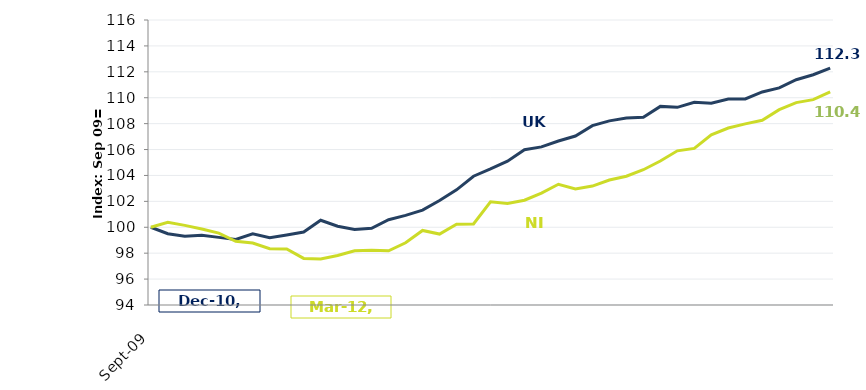
| Category | UK |
|---|---|
| 2009-09-01 | 100 |
| 2009-12-01 | 99.503 |
| 2010-03-01 | 99.303 |
| 2010-06-01 | 99.376 |
| 2010-09-01 | 99.22 |
| 2010-12-01 | 99.064 |
| 2011-03-01 | 99.488 |
| 2011-06-01 | 99.195 |
| 2011-09-01 | 99.401 |
| 2011-12-01 | 99.63 |
| 2012-03-01 | 100.544 |
| 2012-06-01 | 100.076 |
| 2012-09-01 | 99.826 |
| 2012-12-01 | 99.917 |
| 2013-03-01 | 100.58 |
| 2013-06-01 | 100.914 |
| 2013-09-01 | 101.324 |
| 2013-12-01 | 102.064 |
| 2014-03-01 | 102.891 |
| 2014-06-01 | 103.94 |
| 2014-09-01 | 104.502 |
| 2014-12-01 | 105.104 |
| 2015-03-01 | 105.989 |
| 2015-06-01 | 106.204 |
| 2015-09-01 | 106.661 |
| 2015-12-01 | 107.045 |
| 2016-03-01 | 107.843 |
| 2016-06-01 | 108.213 |
| 2016-09-01 | 108.435 |
| 2016-12-01 | 108.493 |
| 2017-03-01 | 109.331 |
| 2017-06-01 | 109.258 |
| 2017-09-01 | 109.65 |
| 2017-12-01 | 109.581 |
| 2018-03-01 | 109.897 |
| 2018-06-01 | 109.904 |
| 2018-09-01 | 110.444 |
| 2018-12-01 | 110.756 |
| 2019-03-01 | 111.391 |
| 2019-06-01 | 111.772 |
| 2019-09-01 | 112.287 |